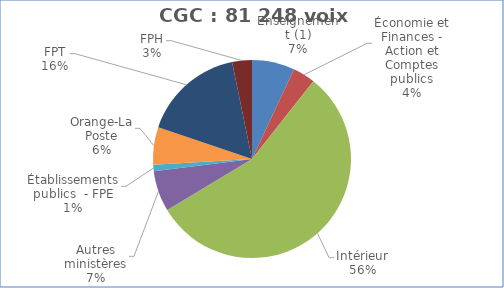
| Category | Nombre de voix |
|---|---|
| Enseignement (1) | 5667 |
| Économie et Finances - Action et Comptes publics | 2983.2 |
| Intérieur | 45270 |
| Autres ministères | 5411 |
| Établissements publics  - FPE | 850 |
| Orange-La Poste | 4986 |
| FPT | 13457 |
| FPH | 2624 |